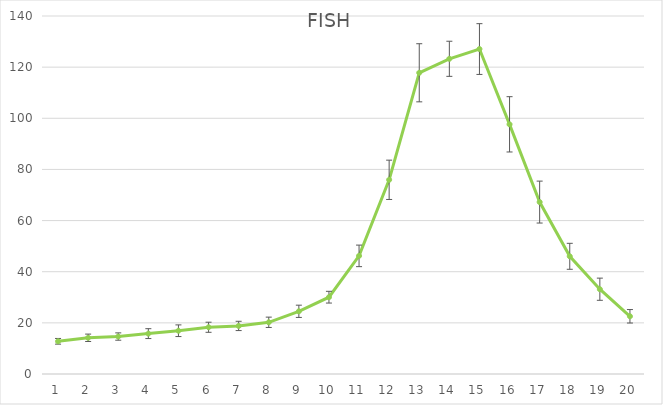
| Category | FISH |
|---|---|
| 0 | 12.788 |
| 1 | 14.156 |
| 2 | 14.646 |
| 3 | 15.793 |
| 4 | 16.922 |
| 5 | 18.281 |
| 6 | 18.798 |
| 7 | 20.217 |
| 8 | 24.516 |
| 9 | 30.036 |
| 10 | 46.195 |
| 11 | 75.936 |
| 12 | 117.795 |
| 13 | 123.264 |
| 14 | 127.077 |
| 15 | 97.636 |
| 16 | 67.233 |
| 17 | 46.028 |
| 18 | 33.155 |
| 19 | 22.567 |